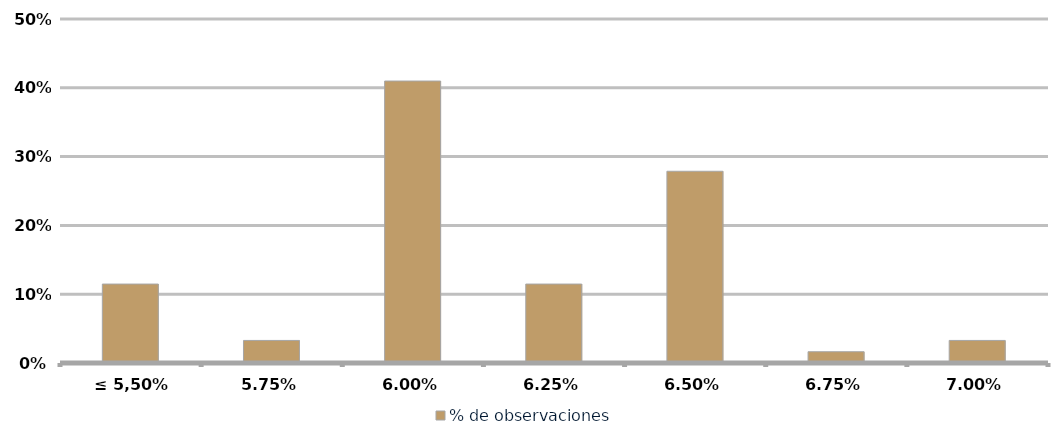
| Category | % de observaciones  |
|---|---|
| ≤ 5,50% | 0.115 |
| 5,75% | 0.033 |
| 6,00% | 0.41 |
| 6,25% | 0.115 |
| 6,50% | 0.279 |
| 6,75% | 0.016 |
| 7,00% | 0.033 |